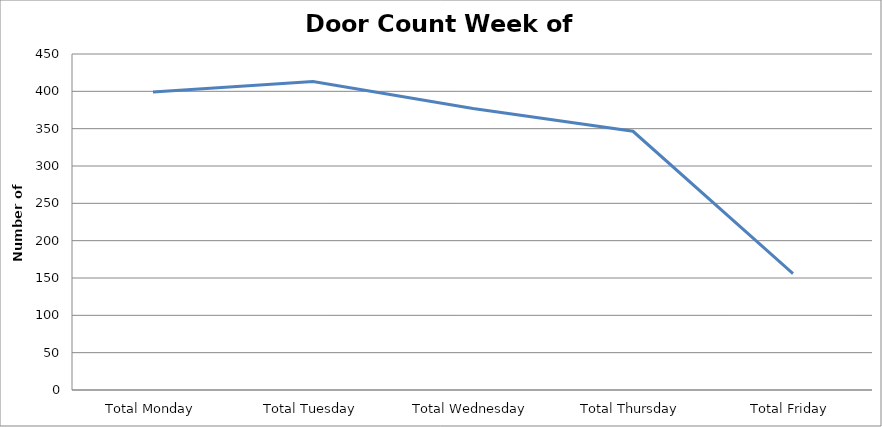
| Category | Series 0 |
|---|---|
| Total Monday | 399 |
| Total Tuesday | 413 |
| Total Wednesday | 377 |
| Total Thursday | 346.5 |
| Total Friday | 156 |